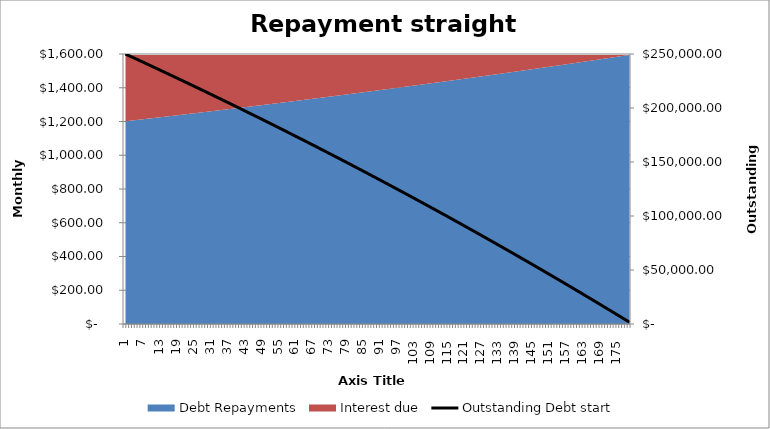
| Category | Outstanding Debt start |
|---|---|
| 0 | 250000 |
| 1 | 248798.548 |
| 2 | 247595.193 |
| 3 | 246389.933 |
| 4 | 245182.765 |
| 5 | 243973.685 |
| 6 | 242762.691 |
| 7 | 241549.779 |
| 8 | 240334.947 |
| 9 | 239118.192 |
| 10 | 237899.51 |
| 11 | 236678.899 |
| 12 | 235456.354 |
| 13 | 234231.875 |
| 14 | 233005.456 |
| 15 | 231777.095 |
| 16 | 230546.79 |
| 17 | 229314.537 |
| 18 | 228080.332 |
| 19 | 226844.174 |
| 20 | 225606.058 |
| 21 | 224365.982 |
| 22 | 223123.942 |
| 23 | 221879.936 |
| 24 | 220633.96 |
| 25 | 219386.012 |
| 26 | 218136.087 |
| 27 | 216884.184 |
| 28 | 215630.298 |
| 29 | 214374.427 |
| 30 | 213116.567 |
| 31 | 211856.716 |
| 32 | 210594.87 |
| 33 | 209331.026 |
| 34 | 208065.181 |
| 35 | 206797.332 |
| 36 | 205527.475 |
| 37 | 204255.608 |
| 38 | 202981.727 |
| 39 | 201705.829 |
| 40 | 200427.911 |
| 41 | 199147.969 |
| 42 | 197866.001 |
| 43 | 196582.003 |
| 44 | 195295.972 |
| 45 | 194007.905 |
| 46 | 192717.799 |
| 47 | 191425.65 |
| 48 | 190131.454 |
| 49 | 188835.21 |
| 50 | 187536.914 |
| 51 | 186236.561 |
| 52 | 184934.15 |
| 53 | 183629.677 |
| 54 | 182323.138 |
| 55 | 181014.531 |
| 56 | 179703.851 |
| 57 | 178391.097 |
| 58 | 177076.263 |
| 59 | 175759.348 |
| 60 | 174440.348 |
| 61 | 173119.26 |
| 62 | 171796.079 |
| 63 | 170470.804 |
| 64 | 169143.431 |
| 65 | 167813.955 |
| 66 | 166482.375 |
| 67 | 165148.686 |
| 68 | 163812.886 |
| 69 | 162474.971 |
| 70 | 161134.937 |
| 71 | 159792.782 |
| 72 | 158448.501 |
| 73 | 157102.092 |
| 74 | 155753.551 |
| 75 | 154402.875 |
| 76 | 153050.061 |
| 77 | 151695.104 |
| 78 | 150338.003 |
| 79 | 148978.752 |
| 80 | 147617.349 |
| 81 | 146253.791 |
| 82 | 144888.074 |
| 83 | 143520.194 |
| 84 | 142150.149 |
| 85 | 140777.934 |
| 86 | 139403.547 |
| 87 | 138026.983 |
| 88 | 136648.24 |
| 89 | 135267.314 |
| 90 | 133884.202 |
| 91 | 132498.899 |
| 92 | 131111.404 |
| 93 | 129721.711 |
| 94 | 128329.818 |
| 95 | 126935.721 |
| 96 | 125539.417 |
| 97 | 124140.902 |
| 98 | 122740.172 |
| 99 | 121337.225 |
| 100 | 119932.057 |
| 101 | 118524.664 |
| 102 | 117115.042 |
| 103 | 115703.188 |
| 104 | 114289.099 |
| 105 | 112872.771 |
| 106 | 111454.201 |
| 107 | 110033.384 |
| 108 | 108610.318 |
| 109 | 107184.999 |
| 110 | 105757.422 |
| 111 | 104327.586 |
| 112 | 102895.486 |
| 113 | 101461.118 |
| 114 | 100024.479 |
| 115 | 98585.565 |
| 116 | 97144.373 |
| 117 | 95700.899 |
| 118 | 94255.14 |
| 119 | 92807.092 |
| 120 | 91356.75 |
| 121 | 89904.113 |
| 122 | 88449.175 |
| 123 | 86991.934 |
| 124 | 85532.386 |
| 125 | 84070.526 |
| 126 | 82606.352 |
| 127 | 81139.86 |
| 128 | 79671.045 |
| 129 | 78199.905 |
| 130 | 76726.436 |
| 131 | 75250.634 |
| 132 | 73772.495 |
| 133 | 72292.016 |
| 134 | 70809.192 |
| 135 | 69324.021 |
| 136 | 67836.499 |
| 137 | 66346.621 |
| 138 | 64854.384 |
| 139 | 63359.784 |
| 140 | 61862.818 |
| 141 | 60363.482 |
| 142 | 58861.771 |
| 143 | 57357.684 |
| 144 | 55851.214 |
| 145 | 54342.359 |
| 146 | 52831.116 |
| 147 | 51317.479 |
| 148 | 49801.446 |
| 149 | 48283.013 |
| 150 | 46762.175 |
| 151 | 45238.93 |
| 152 | 43713.272 |
| 153 | 42185.199 |
| 154 | 40654.707 |
| 155 | 39121.791 |
| 156 | 37586.448 |
| 157 | 36048.674 |
| 158 | 34508.465 |
| 159 | 32965.818 |
| 160 | 31420.728 |
| 161 | 29873.192 |
| 162 | 28323.205 |
| 163 | 26770.765 |
| 164 | 25215.866 |
| 165 | 23658.505 |
| 166 | 22098.679 |
| 167 | 20536.383 |
| 168 | 18971.613 |
| 169 | 17404.366 |
| 170 | 15834.637 |
| 171 | 14262.423 |
| 172 | 12687.719 |
| 173 | 11110.522 |
| 174 | 9530.828 |
| 175 | 7948.633 |
| 176 | 6363.932 |
| 177 | 4776.723 |
| 178 | 3187 |
| 179 | 1594.761 |